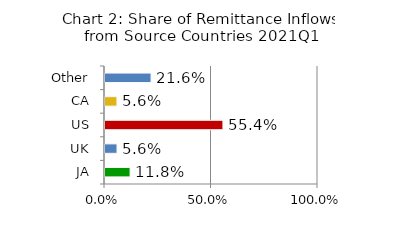
| Category | Chart 2: Share of Remittance Inflows from Source Countries 2021Q2 |
|---|---|
| JA | 0.118 |
| UK | 0.056 |
| US | 0.554 |
| CA | 0.056 |
| Other | 0.216 |